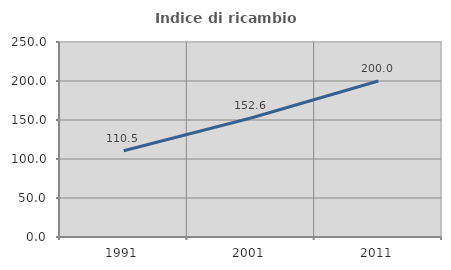
| Category | Indice di ricambio occupazionale  |
|---|---|
| 1991.0 | 110.526 |
| 2001.0 | 152.632 |
| 2011.0 | 200 |